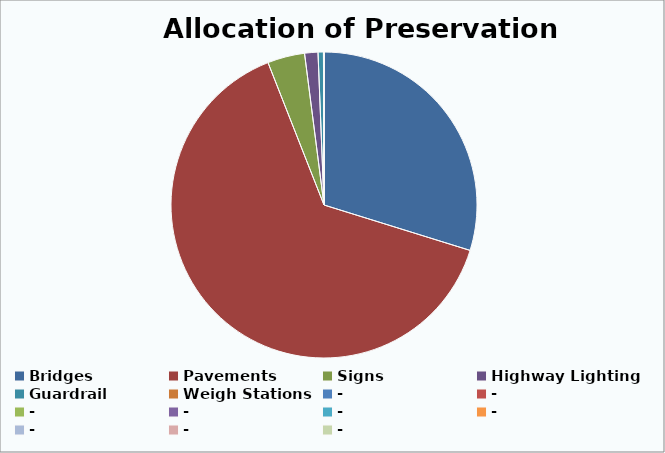
| Category | Series 0 |
|---|---|
| Bridges | 56614462.86 |
| Pavements | 122051958.894 |
| Signs | 7470168.087 |
| Highway Lighting | 2676810.231 |
| Guardrail | 1075821.845 |
| Weigh Stations | 110778.083 |
| - | 0 |
| - | 0 |
| - | 0 |
| - | 0 |
| - | 0 |
| - | 0 |
| - | 0 |
| - | 0 |
| - | 0 |